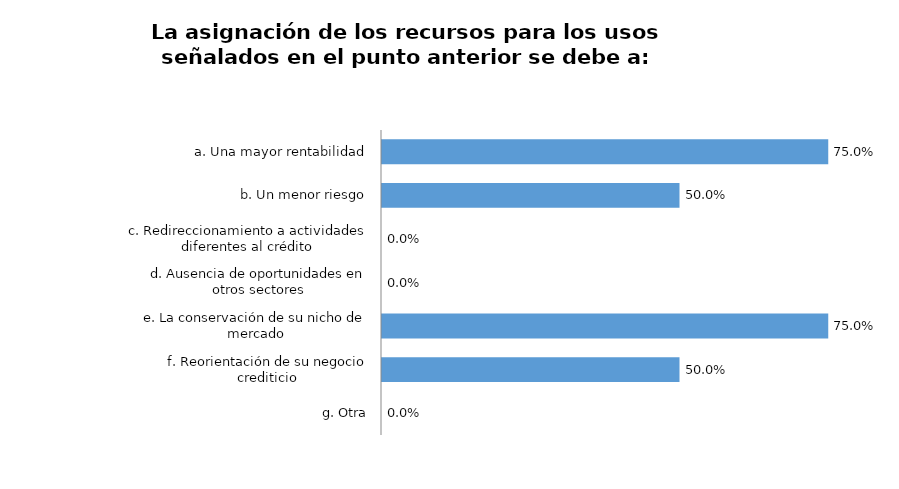
| Category | Series 0 |
|---|---|
| a. Una mayor rentabilidad | 0.75 |
| b. Un menor riesgo | 0.5 |
| c. Redireccionamiento a actividades diferentes al crédito | 0 |
| d. Ausencia de oportunidades en otros sectores | 0 |
| e. La conservación de su nicho de mercado | 0.75 |
| f. Reorientación de su negocio crediticio | 0.5 |
| g. Otra | 0 |